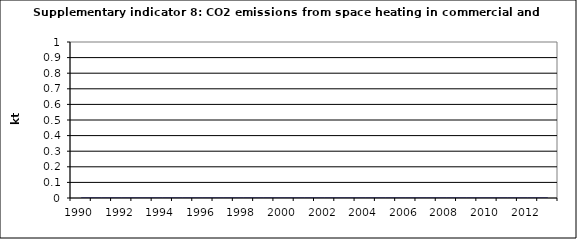
| Category | CO2 emissions from space heating in commercial and institutional, kt |
|---|---|
| 1990 | 0 |
| 1991 | 0 |
| 1992 | 0 |
| 1993 | 0 |
| 1994 | 0 |
| 1995 | 0 |
| 1996 | 0 |
| 1997 | 0 |
| 1998 | 0 |
| 1999 | 0 |
| 2000 | 0 |
| 2001 | 0 |
| 2002 | 0 |
| 2003 | 0 |
| 2004 | 0 |
| 2005 | 0 |
| 2006 | 0 |
| 2007 | 0 |
| 2008 | 0 |
| 2009 | 0 |
| 2010 | 0 |
| 2011 | 0 |
| 2012 | 0 |
| 2013 | 0 |